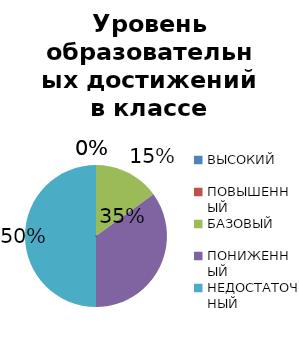
| Category | Series 0 |
|---|---|
| ВЫСОКИЙ | 0 |
| ПОВЫШЕННЫЙ | 0 |
| БАЗОВЫЙ | 9.091 |
| ПОНИЖЕННЫЙ | 21.212 |
| НЕДОСТАТОЧНЫЙ | 30.303 |